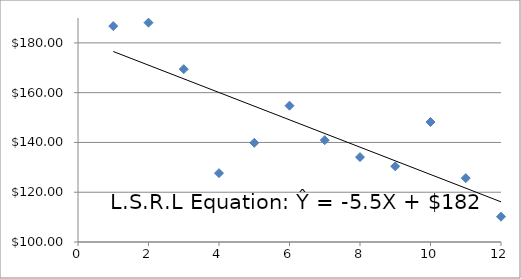
| Category | Series 0 |
|---|---|
| 1.0 | 186.75 |
| 2.0 | 188.12 |
| 3.0 | 169.45 |
| 4.0 | 127.65 |
| 5.0 | 139.87 |
| 6.0 | 154.76 |
| 7.0 | 140.91 |
| 8.0 | 134.12 |
| 9.0 | 130.4 |
| 10.0 | 148.21 |
| 11.0 | 125.67 |
| 12.0 | 110.16 |